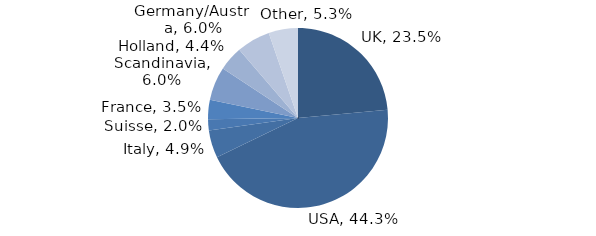
| Category | Investment Style |
|---|---|
| UK | 0.235 |
| USA | 0.443 |
| Italy | 0.049 |
| Suisse | 0.02 |
| France | 0.035 |
| Scandinavia | 0.06 |
| Holland | 0.044 |
| Germany/Austria | 0.06 |
| Other | 0.053 |